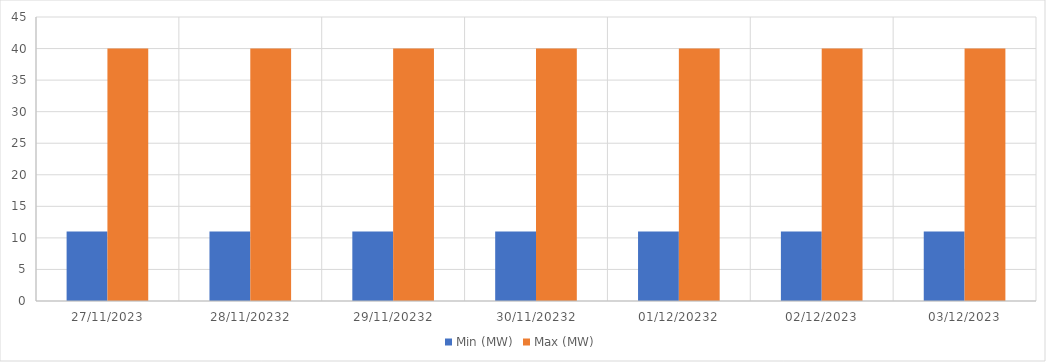
| Category | Min (MW) | Max (MW) |
|---|---|---|
| 27/11/2023 | 11 | 40 |
| 28/11/20232 | 11 | 40 |
| 29/11/20232 | 11 | 40 |
| 30/11/20232 | 11 | 40 |
| 01/12/20232 | 11 | 40 |
| 02/12/2023 | 11 | 40 |
| 03/12/2023 | 11 | 40 |